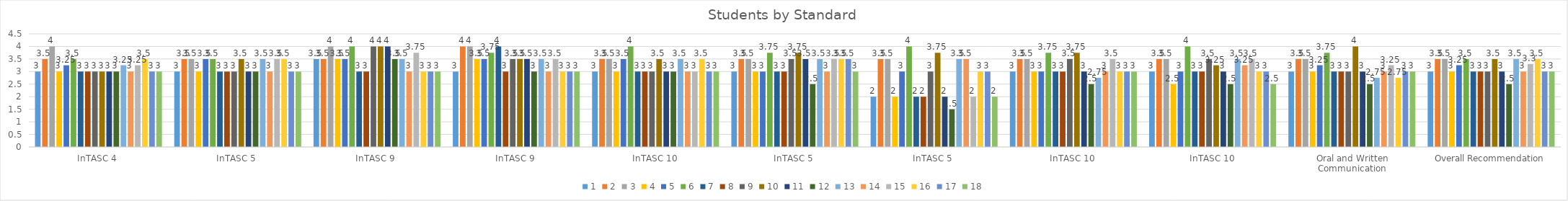
| Category | 1 | 2 | 3 | 4 | 5 | 6 | 7 | 8 | 9 | 10 | 11 | 12 | 13 | 14 | 15 | 16 | 17 | 18 |
|---|---|---|---|---|---|---|---|---|---|---|---|---|---|---|---|---|---|---|
| InTASC 4 | 3 | 3.5 | 4 | 3 | 3.25 | 3.5 | 3 | 3 | 3 | 3 | 3 | 3 | 3.25 | 3 | 3.25 | 3.5 | 3 | 3 |
| InTASC 5 | 3 | 3.5 | 3.5 | 3 | 3.5 | 3.5 | 3 | 3 | 3 | 3.5 | 3 | 3 | 3.5 | 3 | 3.5 | 3.5 | 3 | 3 |
| InTASC 9 | 3.5 | 3.5 | 4 | 3.5 | 3.5 | 4 | 3 | 3 | 4 | 4 | 4 | 3.5 | 3.5 | 3 | 3.75 | 3 | 3 | 3 |
| InTASC 9 | 3 | 4 | 4 | 3.5 | 3.5 | 3.75 | 4 | 3 | 3.5 | 3.5 | 3.5 | 3 | 3.5 | 3 | 3.5 | 3 | 3 | 3 |
| InTASC 10 | 3 | 3.5 | 3.5 | 3 | 3.5 | 4 | 3 | 3 | 3 | 3.5 | 3 | 3 | 3.5 | 3 | 3 | 3.5 | 3 | 3 |
| InTASC 5 | 3 | 3.5 | 3.5 | 3 | 3 | 3.75 | 3 | 3 | 3.5 | 3.75 | 3.5 | 2.5 | 3.5 | 3 | 3.5 | 3.5 | 3.5 | 3 |
| InTASC 5 | 2 | 3.5 | 3.5 | 2 | 3 | 4 | 2 | 2 | 3 | 3.75 | 2 | 1.5 | 3.5 | 3.5 | 2 | 3 | 3 | 2 |
| InTASC 10 | 3 | 3.5 | 3.5 | 3 | 3 | 3.75 | 3 | 3 | 3.5 | 3.75 | 3 | 2.5 | 2.75 | 3 | 3.5 | 3 | 3 | 3 |
| InTASC 10 | 3 | 3.5 | 3.5 | 2.5 | 3 | 4 | 3 | 3 | 3.5 | 3.25 | 3 | 2.5 | 3.5 | 3.25 | 3.5 | 3 | 3 | 2.5 |
| Oral and Written Communication | 3 | 3.5 | 3.5 | 3 | 3.25 | 3.75 | 3 | 3 | 3 | 4 | 3 | 2.5 | 2.75 | 3 | 3.25 | 2.75 | 3 | 3 |
| Overall Recommendation | 3 | 3.5 | 3.5 | 3 | 3.25 | 3.5 | 3 | 3 | 3 | 3.5 | 3 | 2.5 | 3.5 | 3 | 3.3 | 3.5 | 3 | 3 |